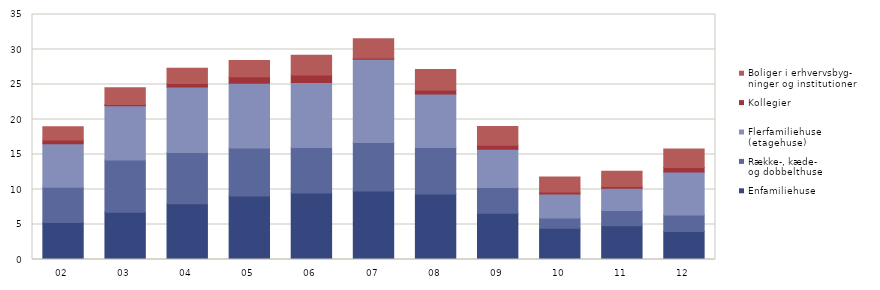
| Category | Enfamiliehuse | Række-, kæde-
og dobbelthuse | Flerfamiliehuse
(etagehuse) | Kollegier | Boliger i erhvervsbyg-
ninger og institutioner |
|---|---|---|---|---|---|
| 02 | 5.269 | 5.063 | 6.199 | 0.54 | 1.886 |
| 03 | 6.736 | 7.493 | 7.72 | 0.198 | 2.373 |
| 04 | 7.961 | 7.339 | 9.328 | 0.513 | 2.198 |
| 05 | 9.074 | 6.859 | 9.247 | 0.944 | 2.309 |
| 06 | 9.514 | 6.495 | 9.291 | 1.054 | 2.821 |
| 07 | 9.768 | 6.959 | 11.875 | 0.201 | 2.733 |
| 08 | 9.365 | 6.622 | 7.641 | 0.588 | 2.913 |
| 09 | 6.619 | 3.656 | 5.466 | 0.564 | 2.707 |
| 10 | 4.454 | 1.487 | 3.421 | 0.279 | 2.154 |
| 11 | 4.83 | 2.173 | 3.161 | 0.278 | 2.148 |
| 12 | 3.986 | 2.389 | 6.123 | 0.637 | 2.666 |